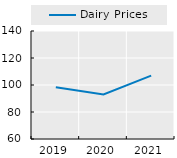
| Category | Dairy Prices |
|---|---|
| 2019.0 | 98.354 |
| 2020.0 | 92.97 |
| 2021.0 | 106.967 |